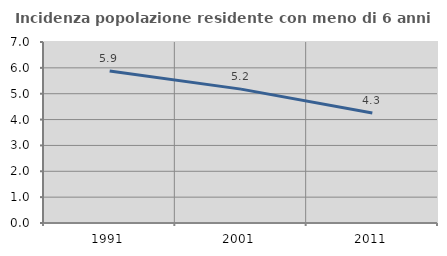
| Category | Incidenza popolazione residente con meno di 6 anni |
|---|---|
| 1991.0 | 5.874 |
| 2001.0 | 5.178 |
| 2011.0 | 4.253 |